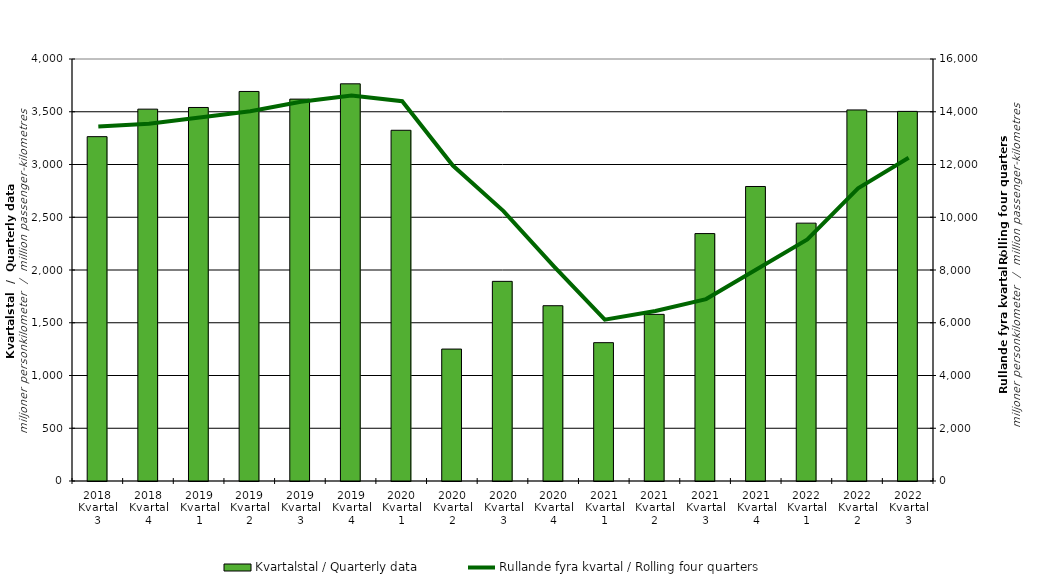
| Category | Kvartalstal / Quarterly data |
|---|---|
| 2018 Kvartal 3 | 3264.066 |
| 2018 Kvartal 4 | 3524.594 |
| 2019 Kvartal 1 | 3540.48 |
| 2019 Kvartal 2 | 3692.248 |
| 2019 Kvartal 3 | 3619.721 |
| 2019 Kvartal 4 | 3764.759 |
| 2020 Kvartal 1 | 3324.383 |
| 2020 Kvartal 2 | 1250.488 |
| 2020 Kvartal 3 | 1892.351 |
| 2020 Kvartal 4 | 1661.523 |
| 2021 Kvartal 1 | 1311.197 |
| 2021 Kvartal 2 | 1579.614 |
| 2021 Kvartal 3 | 2345.169 |
| 2021 Kvartal 4 | 2791.509 |
| 2022 Kvartal 1 | 2444.152 |
| 2022 Kvartal 2 | 3517.085 |
| 2022 Kvartal 3 | 3503.486 |